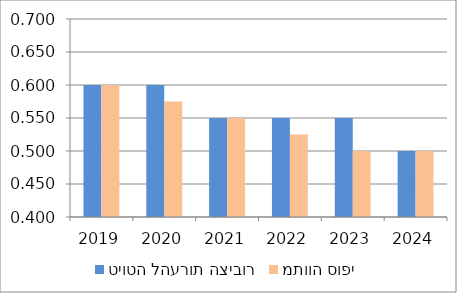
| Category | טיוטה להערות הציבור | מתווה סופי |
|---|---|---|
| 2019.0 | 0.6 | 0.6 |
| 2020.0 | 0.6 | 0.575 |
| 2021.0 | 0.55 | 0.55 |
| 2022.0 | 0.55 | 0.525 |
| 2023.0 | 0.55 | 0.5 |
| 2024.0 | 0.5 | 0.5 |